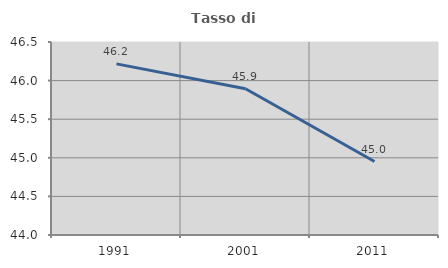
| Category | Tasso di occupazione   |
|---|---|
| 1991.0 | 46.216 |
| 2001.0 | 45.895 |
| 2011.0 | 44.951 |